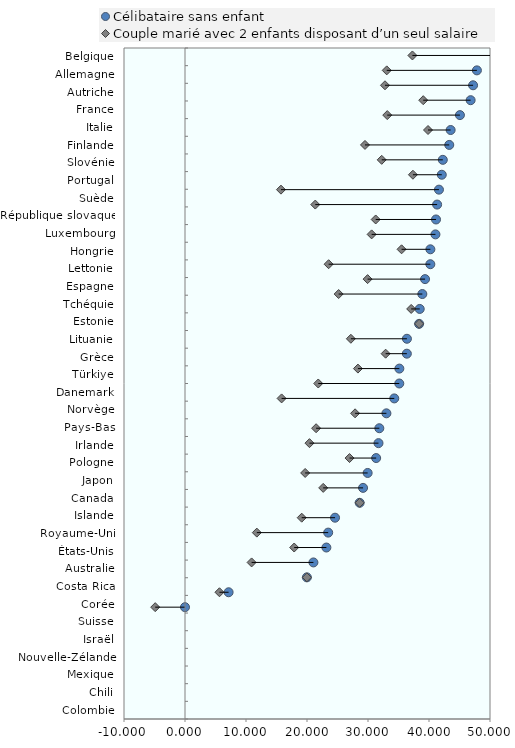
| Category | blankName |
|---|---|
| Colombie | -4.884 |
| Chili | 5.652 |
| Mexique | 19.98 |
| Nouvelle-Zélande | 10.919 |
| Israël | 17.902 |
| Suisse | 11.773 |
| Corée | 19.132 |
| Costa Rica | 28.633 |
| Australie | 22.655 |
| États-Unis | 19.698 |
| Royaume-Uni | 26.974 |
| Islande | 20.407 |
| Canada | 21.493 |
| Japon | 27.884 |
| Pologne | 15.835 |
| Irlande | 21.846 |
| Pays-Bas | 28.349 |
| Norvège | 32.89 |
| Danemark | 27.193 |
| Türkiye | 38.38 |
| Grèce | 37.079 |
| Lituanie | 25.188 |
| Estonie | 29.934 |
| Tchéquie | 23.546 |
| Espagne | 35.503 |
| Lettonie | 30.596 |
| Hongrie | 31.262 |
| Luxembourg | 21.358 |
| République slovaque | 15.733 |
| Suède | 37.366 |
| Portugal | 32.251 |
| Slovénie | 29.506 |
| Finlande | 39.838 |
| Italie | 33.157 |
| France | 39.053 |
| Autriche | 32.786 |
| Allemagne | 33.071 |
| Belgique | 37.284 |